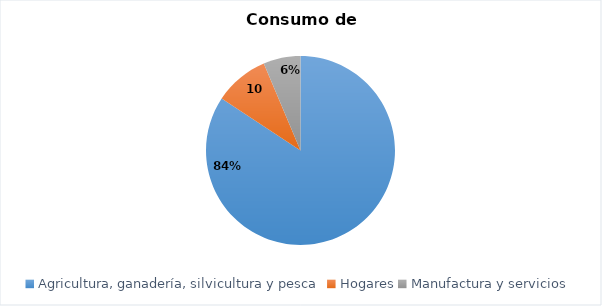
| Category | Series 1 | Series 2 | Series 3 | Series 0 |
|---|---|---|---|---|
| Agricultura, ganadería, silvicultura y pesca | 502.423 | 1731.022 | 1731.022 |  |
| Hogares | 55.819 | 596.262 | 596.262 |  |
| Manufactura y servicios | 37.838 | 138.837 | 138.837 |  |